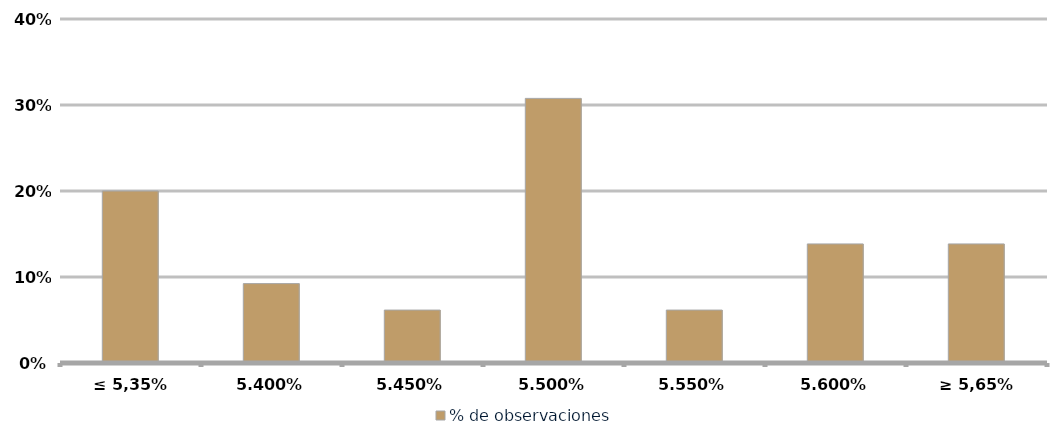
| Category | % de observaciones  |
|---|---|
| ≤ 5,35% | 0.2 |
| 5,40% | 0.092 |
| 5,45% | 0.062 |
| 5,50% | 0.308 |
| 5,55% | 0.062 |
| 5,60% | 0.138 |
| ≥ 5,65% | 0.138 |